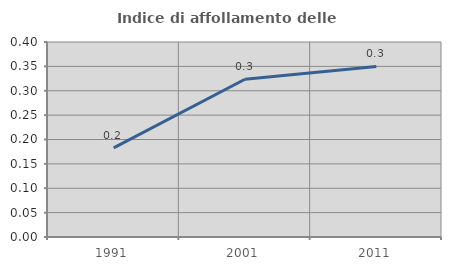
| Category | Indice di affollamento delle abitazioni  |
|---|---|
| 1991.0 | 0.183 |
| 2001.0 | 0.324 |
| 2011.0 | 0.35 |